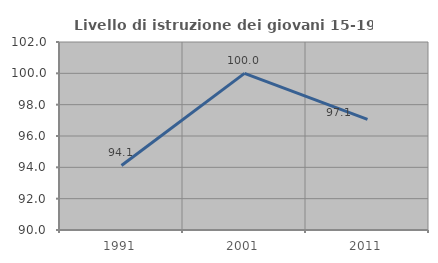
| Category | Livello di istruzione dei giovani 15-19 anni |
|---|---|
| 1991.0 | 94.118 |
| 2001.0 | 100 |
| 2011.0 | 97.059 |